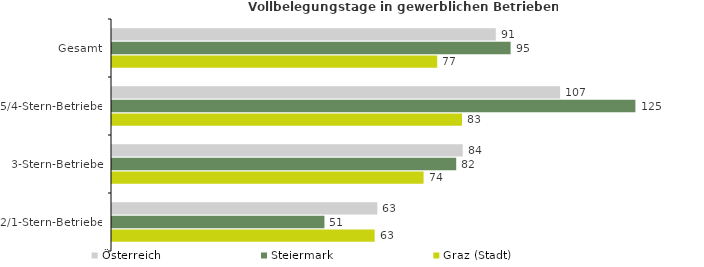
| Category | Österreich | Steiermark | Graz (Stadt) |
|---|---|---|---|
| Gesamt | 91.375 | 94.907 | 77.436 |
| 5/4-Stern-Betriebe | 106.695 | 124.622 | 83.332 |
| 3-Stern-Betriebe | 83.508 | 81.957 | 74.186 |
| 2/1-Stern-Betriebe | 63.173 | 50.58 | 62.54 |